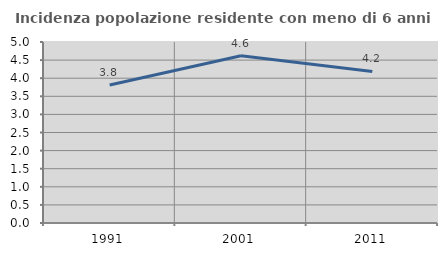
| Category | Incidenza popolazione residente con meno di 6 anni |
|---|---|
| 1991.0 | 3.813 |
| 2001.0 | 4.618 |
| 2011.0 | 4.186 |